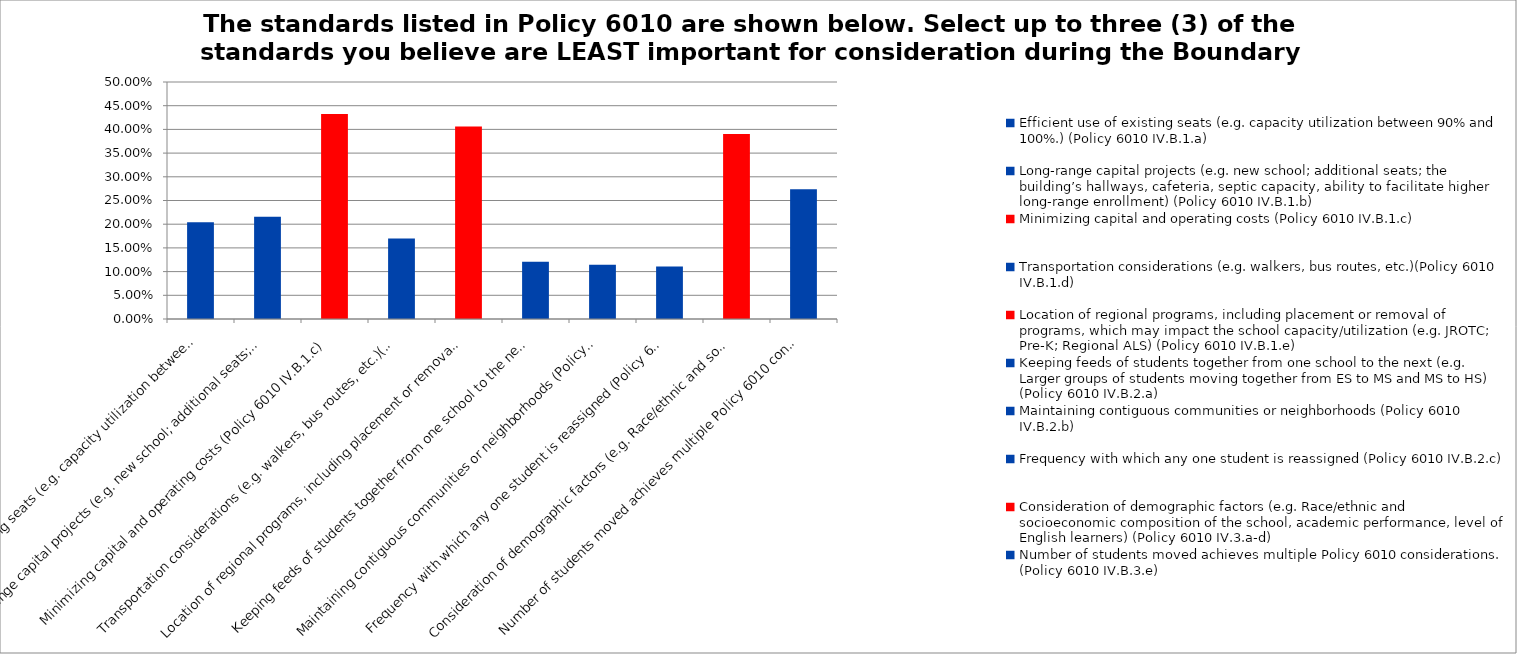
| Category | Responses |
|---|---|
| Efficient use of existing seats (e.g. capacity utilization between 90% and 100%.) (Policy 6010 IV.B.1.a) | 0.204 |
| Long-range capital projects (e.g. new school; additional seats; the building’s hallways, cafeteria, septic capacity, ability to facilitate higher long-range enrollment) (Policy 6010 IV.B.1.b) | 0.216 |
| Minimizing capital and operating costs (Policy 6010 IV.B.1.c) | 0.432 |
| Transportation considerations (e.g. walkers, bus routes, etc.)(Policy 6010 IV.B.1.d) | 0.17 |
| Location of regional programs, including placement or removal of programs, which may impact the school capacity/utilization (e.g. JROTC; Pre-K; Regional ALS) (Policy 6010 IV.B.1.e) | 0.406 |
| Keeping feeds of students together from one school to the next (e.g. Larger groups of students moving together from ES to MS and MS to HS) (Policy 6010 IV.B.2.a) | 0.121 |
| Maintaining contiguous communities or neighborhoods (Policy 6010 IV.B.2.b) | 0.114 |
| Frequency with which any one student is reassigned (Policy 6010 IV.B.2.c) | 0.111 |
| Consideration of demographic factors (e.g. Race/ethnic and socioeconomic composition of the school, academic performance, level of English learners) (Policy 6010 IV.3.a-d) | 0.39 |
| Number of students moved achieves multiple Policy 6010 considerations. (Policy 6010 IV.B.3.e) | 0.274 |